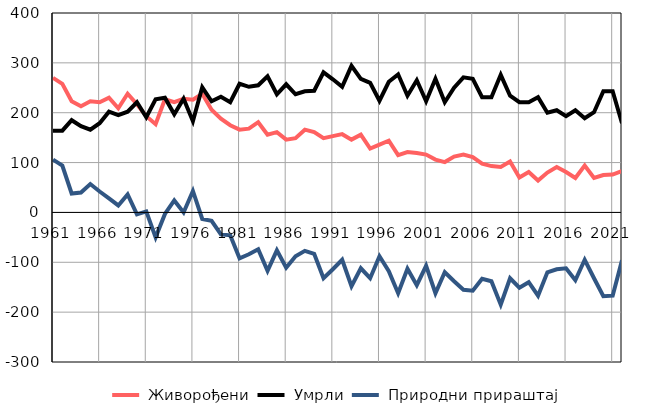
| Category |  Живорођени |  Умрли |  Природни прираштај |
|---|---|---|---|
| 1961.0 | 270 | 164 | 106 |
| 1962.0 | 258 | 164 | 94 |
| 1963.0 | 223 | 185 | 38 |
| 1964.0 | 213 | 173 | 40 |
| 1965.0 | 223 | 166 | 57 |
| 1966.0 | 221 | 179 | 42 |
| 1967.0 | 230 | 202 | 28 |
| 1968.0 | 209 | 195 | 14 |
| 1969.0 | 238 | 202 | 36 |
| 1970.0 | 217 | 221 | -4 |
| 1971.0 | 193 | 191 | 2 |
| 1972.0 | 177 | 227 | -50 |
| 1973.0 | 227 | 230 | -3 |
| 1974.0 | 221 | 197 | 24 |
| 1975.0 | 228 | 228 | 0 |
| 1976.0 | 226 | 183 | 43 |
| 1977.0 | 238 | 251 | -13 |
| 1978.0 | 206 | 223 | -17 |
| 1979.0 | 188 | 232 | -44 |
| 1980.0 | 175 | 221 | -46 |
| 1981.0 | 166 | 258 | -92 |
| 1982.0 | 168 | 252 | -84 |
| 1983.0 | 181 | 255 | -74 |
| 1984.0 | 156 | 273 | -117 |
| 1985.0 | 161 | 237 | -76 |
| 1986.0 | 146 | 257 | -111 |
| 1987.0 | 149 | 237 | -88 |
| 1988.0 | 166 | 243 | -77 |
| 1989.0 | 161 | 244 | -83 |
| 1990.0 | 149 | 281 | -132 |
| 1991.0 | 153 | 267 | -114 |
| 1992.0 | 157 | 252 | -95 |
| 1993.0 | 146 | 294 | -148 |
| 1994.0 | 156 | 268 | -112 |
| 1995.0 | 128 | 260 | -132 |
| 1996.0 | 136 | 224 | -88 |
| 1997.0 | 144 | 262 | -118 |
| 1998.0 | 115 | 277 | -162 |
| 1999.0 | 121 | 234 | -113 |
| 2000.0 | 119 | 265 | -146 |
| 2001.0 | 116 | 223 | -107 |
| 2002.0 | 106 | 268 | -162 |
| 2003.0 | 101 | 221 | -120 |
| 2004.0 | 112 | 250 | -138 |
| 2005.0 | 116 | 271 | -155 |
| 2006.0 | 111 | 268 | -157 |
| 2007.0 | 98 | 231 | -133 |
| 2008.0 | 93 | 231 | -138 |
| 2009.0 | 91 | 276 | -185 |
| 2010.0 | 102 | 234 | -132 |
| 2011.0 | 70 | 221 | -151 |
| 2012.0 | 81 | 221 | -140 |
| 2013.0 | 64 | 231 | -167 |
| 2014.0 | 80 | 200 | -120 |
| 2015.0 | 91 | 205 | -114 |
| 2016.0 | 81 | 193 | -112 |
| 2017.0 | 69 | 205 | -136 |
| 2018.0 | 94 | 189 | -95 |
| 2019.0 | 69 | 201 | -132 |
| 2020.0 | 75 | 243 | -168 |
| 2021.0 | 76 | 243 | -167 |
| 2022.0 | 83 | 179 | -96 |